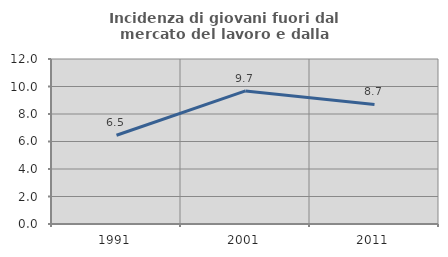
| Category | Incidenza di giovani fuori dal mercato del lavoro e dalla formazione  |
|---|---|
| 1991.0 | 6.452 |
| 2001.0 | 9.677 |
| 2011.0 | 8.696 |